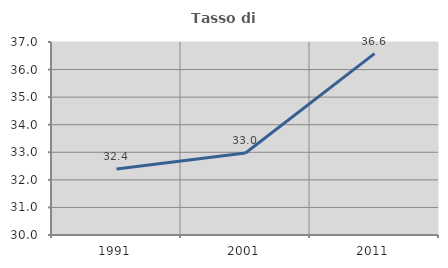
| Category | Tasso di occupazione   |
|---|---|
| 1991.0 | 32.392 |
| 2001.0 | 32.972 |
| 2011.0 | 36.579 |